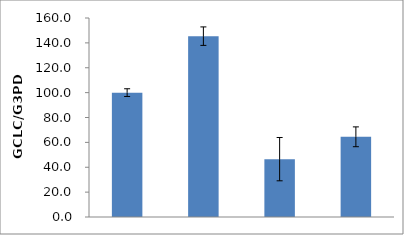
| Category | Series 0 |
|---|---|
| 0 | 100 |
| 1 | 145.407 |
| 2 | 46.51 |
| 3 | 64.485 |